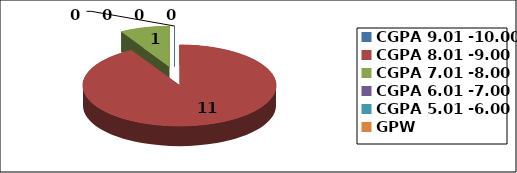
| Category | Series 0 |
|---|---|
| CGPA 9.01 -10.00 | 0 |
| CGPA 8.01 -9.00 | 11 |
| CGPA 7.01 -8.00 | 1 |
| CGPA 6.01 -7.00 | 0 |
| CGPA 5.01 -6.00 | 0 |
| GPW | 0 |